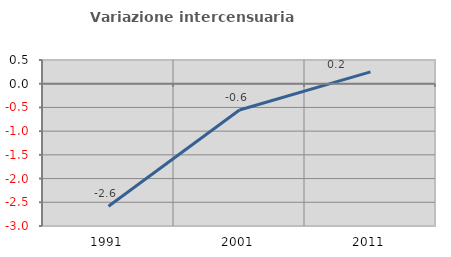
| Category | Variazione intercensuaria annua |
|---|---|
| 1991.0 | -2.583 |
| 2001.0 | -0.555 |
| 2011.0 | 0.249 |